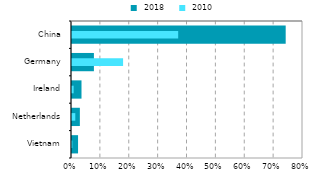
| Category |  2018 |
|---|---|
| Vietnam | 0.021 |
| Netherlands | 0.027 |
| Ireland | 0.033 |
| Germany | 0.076 |
| China | 0.74 |